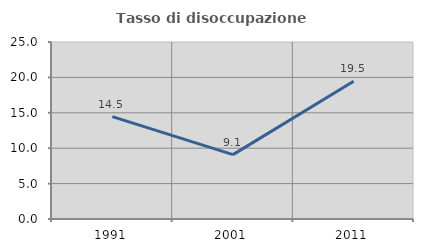
| Category | Tasso di disoccupazione giovanile  |
|---|---|
| 1991.0 | 14.458 |
| 2001.0 | 9.091 |
| 2011.0 | 19.463 |